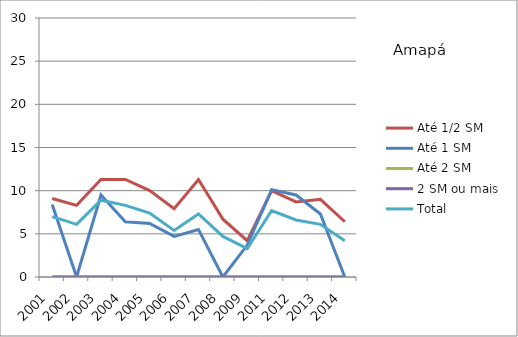
| Category | Até 1/2 SM | Até 1 SM | Até 2 SM | 2 SM ou mais | Total |
|---|---|---|---|---|---|
| 2001.0 | 9.1 | 8.4 | 0 | 0 | 7 |
| 2002.0 | 8.3 | 0 | 0 | 0 | 6.1 |
| 2003.0 | 11.3 | 9.5 | 0 | 0 | 8.9 |
| 2004.0 | 11.3 | 6.4 | 0 | 0 | 8.3 |
| 2005.0 | 10 | 6.2 | 0 | 0 | 7.4 |
| 2006.0 | 7.9 | 4.7 | 0 | 0 | 5.4 |
| 2007.0 | 11.3 | 5.5 | 0 | 0 | 7.3 |
| 2008.0 | 6.7 | 0 | 0 | 0 | 4.7 |
| 2009.0 | 4.2 | 3.7 | 0 | 0 | 3.3 |
| 2011.0 | 10 | 10.1 | 0 | 0 | 7.7 |
| 2012.0 | 8.7 | 9.5 | 0 | 0 | 6.6 |
| 2013.0 | 9 | 7.3 | 0 | 0 | 6.1 |
| 2014.0 | 6.4 | 0 | 0 | 0 | 4.2 |